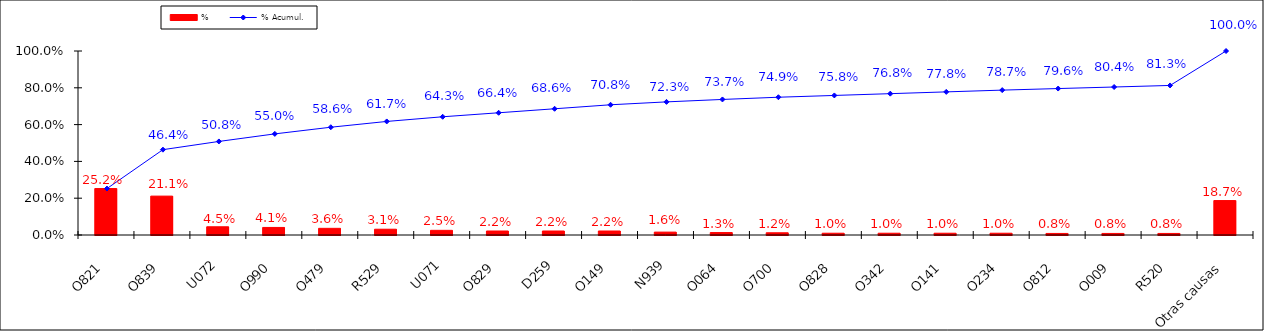
| Category | % |
|---|---|
| O821 | 0.252 |
| O839 | 0.211 |
| U072 | 0.045 |
| O990 | 0.041 |
| O479 | 0.036 |
| R529 | 0.031 |
| U071 | 0.025 |
| O829 | 0.022 |
| D259 | 0.022 |
| O149 | 0.022 |
| N939 | 0.016 |
| O064 | 0.013 |
| O700 | 0.012 |
| O828 | 0.01 |
| O342 | 0.01 |
| O141 | 0.01 |
| O234 | 0.01 |
| O812 | 0.008 |
| O009 | 0.008 |
| R520 | 0.008 |
| Otras causas | 0.187 |